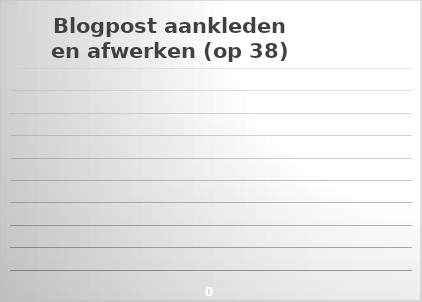
| Category | Totaal (op 38) |
|---|---|
| 0 | 0 |